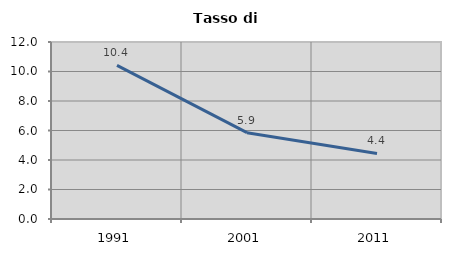
| Category | Tasso di disoccupazione   |
|---|---|
| 1991.0 | 10.413 |
| 2001.0 | 5.853 |
| 2011.0 | 4.443 |